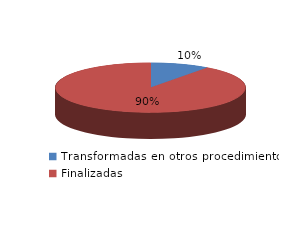
| Category | Series 0 |
|---|---|
| Transformadas en otros procedimientos | 8280 |
| Finalizadas | 74279 |